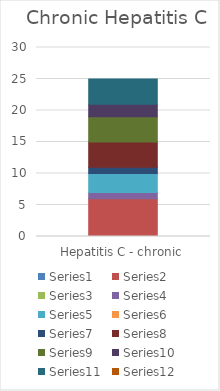
| Category | Series 0 | Series 1 | Series 2 | Series 3 | Series 4 | Series 5 | Series 6 | Series 7 | Series 8 | Series 9 | Series 10 | Series 11 |
|---|---|---|---|---|---|---|---|---|---|---|---|---|
| Hepatitis C - chronic | 0 | 6 | 0 | 1 | 3 | 0 | 1 | 4 | 4 | 2 | 4 | 0 |